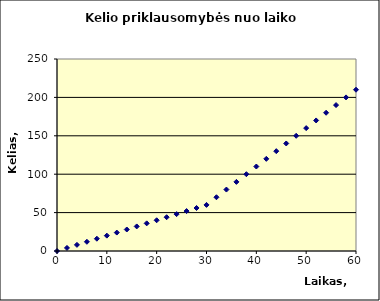
| Category | Series 0 |
|---|---|
| 0.0 | 0 |
| 2.0 | 4 |
| 4.0 | 8 |
| 6.0 | 12 |
| 8.0 | 16 |
| 10.0 | 20 |
| 12.0 | 24 |
| 14.0 | 28 |
| 16.0 | 32 |
| 18.0 | 36 |
| 20.0 | 40 |
| 22.0 | 44 |
| 24.0 | 48 |
| 26.0 | 52 |
| 28.0 | 56 |
| 30.0 | 60 |
| 32.0 | 70 |
| 34.0 | 80 |
| 36.0 | 90 |
| 38.0 | 100 |
| 40.0 | 110 |
| 42.0 | 120 |
| 44.0 | 130 |
| 46.0 | 140 |
| 48.0 | 150 |
| 50.0 | 160 |
| 52.0 | 170 |
| 54.0 | 180 |
| 56.0 | 190 |
| 58.0 | 200 |
| 60.0 | 210 |